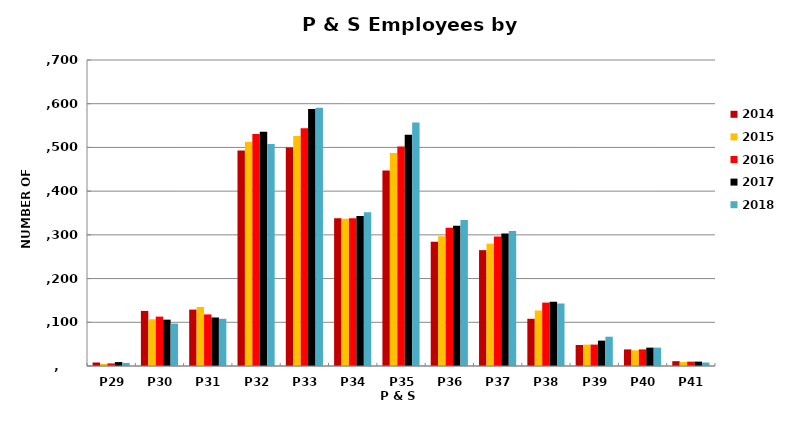
| Category | 2014 | 2015 | 2016 | 2017 | 2018 |
|---|---|---|---|---|---|
| P29 | 8 | 5 | 6 | 9 | 7 |
| P30 | 126 | 107 | 113 | 106 | 97 |
| P31 | 129 | 135 | 118 | 111 | 108 |
| P32 | 493 | 513 | 531 | 536 | 508 |
| P33 | 500 | 526 | 544 | 588 | 591 |
| P34 | 338 | 337 | 338 | 343 | 352 |
| P35 | 447 | 487 | 502 | 529 | 557 |
| P36 | 284 | 297 | 316 | 321 | 334 |
| P37 | 265 | 280 | 296 | 303 | 309 |
| P38 | 108 | 127 | 145 | 147 | 143 |
| P39 | 48 | 49 | 49 | 58 | 67 |
| P40 | 38 | 36 | 38 | 42 | 42 |
| P41 | 11 | 9 | 10 | 10 | 8 |